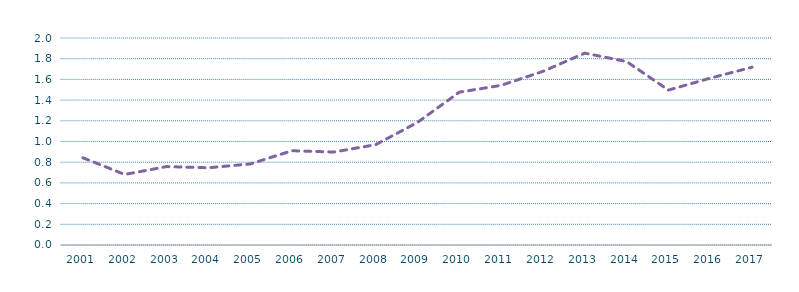
| Category | Generación resto de renovables/Generacion total (%) |
|---|---|
| 2001.0 | 0.843 |
| 2002.0 | 0.682 |
| 2003.0 | 0.758 |
| 2004.0 | 0.746 |
| 2005.0 | 0.783 |
| 2006.0 | 0.911 |
| 2007.0 | 0.898 |
| 2008.0 | 0.969 |
| 2009.0 | 1.185 |
| 2010.0 | 1.477 |
| 2011.0 | 1.543 |
| 2012.0 | 1.678 |
| 2013.0 | 1.854 |
| 2014.0 | 1.772 |
| 2015.0 | 1.497 |
| 2016.0 | 1.612 |
| 2017.0 | 1.718 |